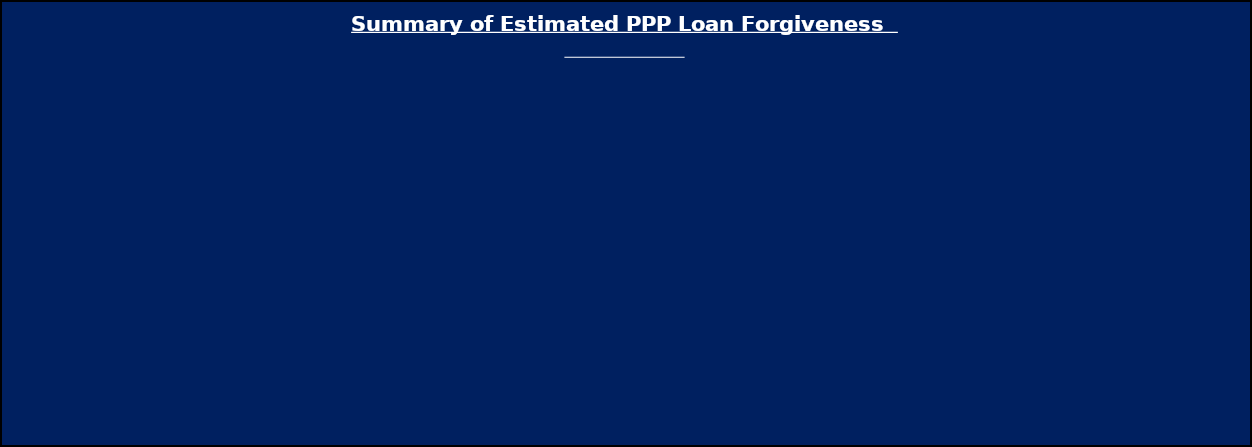
| Category | Series 0 |
|---|---|
| Eligible for Forgiveness | 0 |
| Must Be Spent on Payroll Costs | 0 |
| Can Be Spent on Any Authorized Use | 0 |